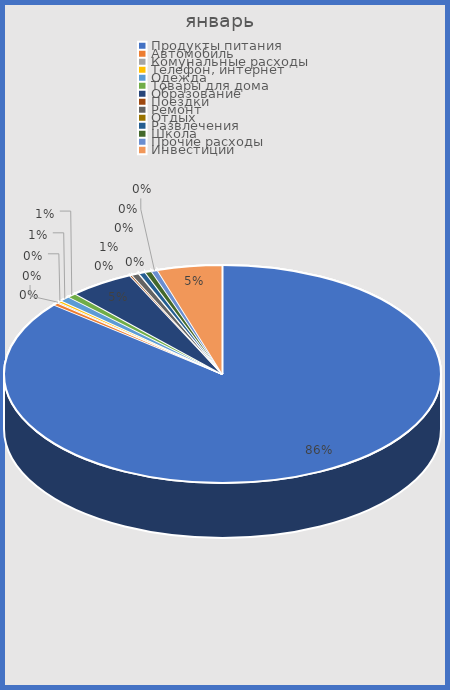
| Category | Series 0 |
|---|---|
| Продукты питания | 0.86 |
| Автомобиль | 0.004 |
| Комунальные расходы | 0.001 |
| Телефон, интернет | 0.003 |
| Одежда | 0.008 |
| Товары для дома | 0.007 |
| Образование | 0.048 |
| Поездки | 0.002 |
| Ремонт | 0.005 |
| Отдых | 0 |
| Развлечения | 0.005 |
| Школа | 0.005 |
| Прочие расходы | 0.005 |
| Инвестиции | 0.048 |